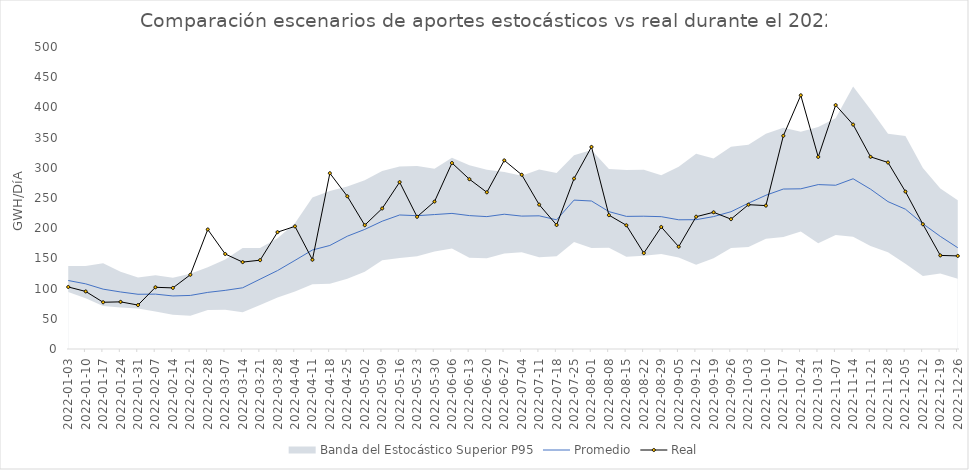
| Category | Promedio | Real |
|---|---|---|
| 2022-01-03 | 113.395 | 102.68 |
| 2022-01-10 | 107.894 | 95.296 |
| 2022-01-17 | 99.098 | 77.385 |
| 2022-01-24 | 94.431 | 78.05 |
| 2022-01-31 | 90.611 | 72.742 |
| 2022-02-07 | 90.849 | 102.163 |
| 2022-02-14 | 87.812 | 101.157 |
| 2022-02-21 | 88.694 | 122.926 |
| 2022-02-28 | 93.727 | 197.88 |
| 2022-03-07 | 97.063 | 157.287 |
| 2022-03-14 | 101.364 | 143.866 |
| 2022-03-21 | 115.66 | 147.086 |
| 2022-03-28 | 129.86 | 193.454 |
| 2022-04-04 | 146.722 | 203.041 |
| 2022-04-11 | 163.899 | 147.81 |
| 2022-04-18 | 171.432 | 291.025 |
| 2022-04-25 | 186.745 | 252.873 |
| 2022-05-02 | 197.987 | 204.997 |
| 2022-05-09 | 211.566 | 232.682 |
| 2022-05-16 | 221.883 | 276.252 |
| 2022-05-23 | 220.703 | 218.854 |
| 2022-05-30 | 222.588 | 244.076 |
| 2022-06-06 | 224.509 | 307.959 |
| 2022-06-13 | 220.846 | 281.133 |
| 2022-06-20 | 219.18 | 259.437 |
| 2022-06-27 | 223.146 | 312.284 |
| 2022-07-04 | 220.04 | 288.463 |
| 2022-07-11 | 220.487 | 239.006 |
| 2022-07-18 | 213.883 | 205.304 |
| 2022-07-25 | 246.516 | 282.174 |
| 2022-08-01 | 245.024 | 334.578 |
| 2022-08-08 | 227.453 | 221.613 |
| 2022-08-15 | 219.569 | 204.827 |
| 2022-08-22 | 219.849 | 158.732 |
| 2022-08-29 | 219.099 | 201.99 |
| 2022-09-05 | 213.937 | 169.347 |
| 2022-09-12 | 214.106 | 219.028 |
| 2022-09-19 | 219.216 | 226.343 |
| 2022-09-26 | 227.29 | 215.001 |
| 2022-10-03 | 241.462 | 238.947 |
| 2022-10-10 | 254.55 | 237.41 |
| 2022-10-17 | 264.827 | 352.982 |
| 2022-10-24 | 265.223 | 420.028 |
| 2022-10-31 | 272.209 | 317.99 |
| 2022-11-07 | 271.111 | 403.777 |
| 2022-11-14 | 281.863 | 371.55 |
| 2022-11-21 | 264.607 | 318.115 |
| 2022-11-28 | 243.99 | 308.815 |
| 2022-12-05 | 231.464 | 260.622 |
| 2022-12-12 | 207.384 | 206.546 |
| 2022-12-19 | 186.464 | 154.953 |
| 2022-12-26 | 167.659 | 154.123 |